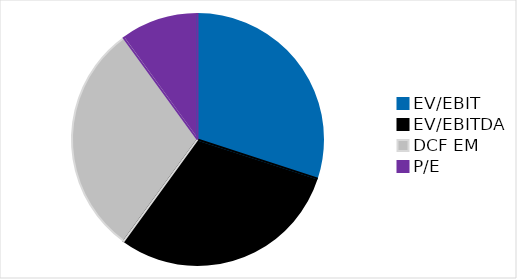
| Category | % |
|---|---|
| EV/EBIT | 0.3 |
| EV/EBITDA | 0.3 |
| DCF EM | 0.3 |
| P/E | 0.1 |